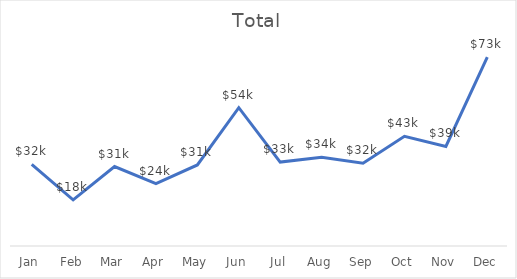
| Category | Total |
|---|---|
| Jan | 31695.34 |
| Feb | 17920.89 |
| Mar | 30853.52 |
| Apr | 24202.53 |
| May | 31483.35 |
| Jun | 53706.84 |
| Jul | 32603.24 |
| Aug | 34493.75 |
| Sep | 32177.57 |
| Oct | 42581.69 |
| Nov | 38653.48 |
| Dec | 73340.87 |